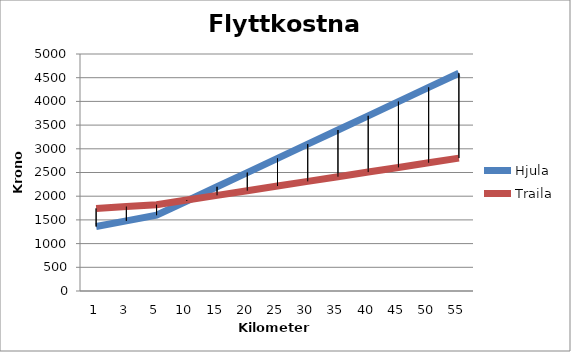
| Category | Hjula | Traila |
|---|---|---|
| 1.0 | 1359.902 | 1742.857 |
| 3.0 | 1479.706 | 1782.143 |
| 5.0 | 1599.51 | 1821.429 |
| 10.0 | 1899.02 | 1919.643 |
| 15.0 | 2198.529 | 2017.857 |
| 20.0 | 2498.039 | 2116.071 |
| 25.0 | 2797.549 | 2214.286 |
| 30.0 | 3097.059 | 2312.5 |
| 35.0 | 3396.569 | 2410.714 |
| 40.0 | 3696.078 | 2508.929 |
| 45.0 | 3995.588 | 2607.143 |
| 50.0 | 4295.098 | 2705.357 |
| 55.0 | 4594.608 | 2803.571 |